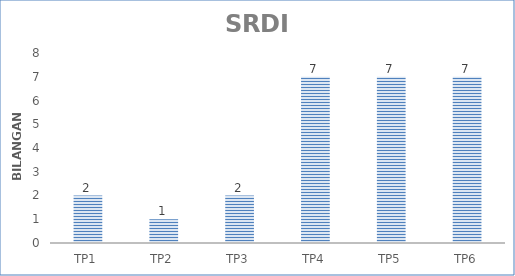
| Category | Series 0 |
|---|---|
| TP1 | 2 |
| TP2 | 1 |
| TP3 | 2 |
| TP4 | 7 |
| TP5 | 7 |
| TP6 | 7 |